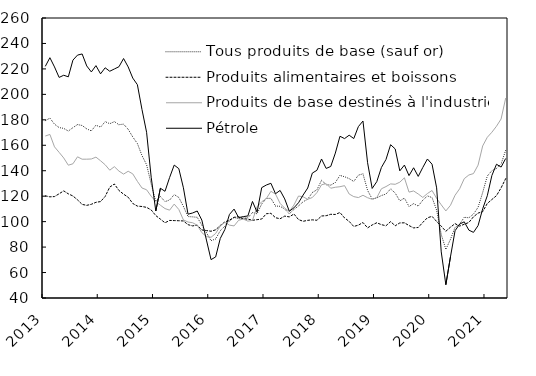
| Category | Tous produits de base (sauf or) | Produits alimentaires et boissons | Produits de base destinés à l'industrie | Pétrole |
|---|---|---|---|---|
| 2013 | 179.315 | 120.259 | 167.262 | 222.008 |
| 2013M2 | 181.359 | 119.479 | 168.512 | 228.805 |
| 2013M3 | 176.563 | 119.709 | 158.758 | 221.554 |
| 2013M4 | 173.905 | 121.885 | 154.441 | 213.313 |
| 2013M5 | 173.269 | 124.173 | 150.035 | 215.012 |
| 2013M6 | 171.169 | 121.837 | 144.348 | 213.779 |
| 2013M7 | 173.862 | 120.159 | 145.452 | 226.912 |
| 2013M8 | 176.258 | 117.119 | 150.925 | 230.852 |
| 2013M9 | 175.54 | 113.543 | 149.044 | 231.745 |
| 2013M10 | 172.863 | 112.804 | 149.074 | 222.316 |
| 2013M11 | 171.323 | 113.624 | 149.215 | 217.609 |
| 2013M12 | 175.774 | 115.189 | 150.677 | 222.568 |
| 2014 | 174.265 | 115.747 | 147.819 | 216.112 |
| 2014M2 | 178.546 | 119.764 | 144.708 | 220.88 |
| 2014M3 | 176.935 | 127.13 | 140.427 | 218.154 |
| 2014M4 | 178.571 | 129.574 | 143.177 | 219.945 |
| 2014M5 | 176.184 | 124.464 | 139.708 | 221.712 |
| 2014M6 | 176.61 | 121.591 | 137.345 | 228.155 |
| 2014M7 | 172.544 | 119.182 | 139.59 | 221.556 |
| 2014M8 | 166.509 | 114.278 | 137.52 | 212.788 |
| 2014M9 | 161.373 | 112.203 | 131.649 | 207.607 |
| 2014M10 | 151.914 | 111.897 | 126.427 | 188.066 |
| 2014M11 | 144.728 | 111.204 | 125.038 | 170.229 |
| 2014M12 | 129.62 | 109.182 | 119.964 | 134.86 |
| 2015 | 115.802 | 104.764 | 115.766 | 108.343 |
| 2015M2 | 119.77 | 101.967 | 112.895 | 126.228 |
| 2015M3 | 115.739 | 99.109 | 110.26 | 123.821 |
| 2015M4 | 116.979 | 100.93 | 109.024 | 134.673 |
| 2015M5 | 121.255 | 100.83 | 113.79 | 144.433 |
| 2015M6 | 118.975 | 100.704 | 109.543 | 141.632 |
| 2015M7 | 111.918 | 100.545 | 101.336 | 126.587 |
| 2015M8 | 103.991 | 97.611 | 99.683 | 105.847 |
| 2015M9 | 103.752 | 96.656 | 99.125 | 106.8 |
| 2015M10 | 103.387 | 97.253 | 97.182 | 108.349 |
| 2015M11 | 97.273 | 93.465 | 91.345 | 101.211 |
| 2015M12 | 91.34 | 92.995 | 88.243 | 85.533 |
| 2016 | 85.03 | 92.448 | 87.712 | 70.151 |
| 2016M2 | 86.381 | 93.565 | 90.702 | 72.264 |
| 2016M3 | 92.904 | 96.979 | 96.516 | 86.755 |
| 2016M4 | 96.447 | 99.745 | 99.375 | 93.788 |
| 2016M5 | 100.548 | 101.157 | 97.25 | 105.65 |
| 2016M6 | 103.318 | 103.398 | 96.635 | 109.862 |
| 2016M7 | 102.342 | 103.867 | 101.092 | 103.171 |
| 2016M8 | 102.839 | 102.184 | 102.013 | 103.943 |
| 2016M9 | 103.032 | 101.994 | 100.398 | 104.458 |
| 2016M10 | 107.148 | 101.066 | 101.007 | 115.851 |
| 2016M11 | 106.174 | 101.55 | 111.672 | 107.406 |
| 2016M12 | 113.838 | 102.048 | 115.628 | 126.701 |
| 2017 | 118.217 | 106.217 | 118.061 | 128.753 |
| 2017M2 | 118.348 | 106.52 | 123.831 | 130.134 |
| 2017M3 | 112.254 | 103.07 | 121.685 | 121.938 |
| 2017M4 | 112.061 | 102.277 | 114.313 | 124.52 |
| 2017M5 | 109.868 | 104.346 | 110.609 | 117.836 |
| 2017M6 | 106.175 | 103.717 | 107.98 | 108.209 |
| 2017M7 | 109.552 | 106.036 | 113.036 | 110.834 |
| 2017M8 | 112.351 | 101.615 | 120.119 | 114.853 |
| 2017M9 | 115.612 | 100.278 | 119.493 | 120.9 |
| 2017M10 | 117.624 | 101.026 | 117.539 | 126.426 |
| 2017M11 | 122.9 | 101.414 | 118.953 | 138.154 |
| 2017M12 | 125.015 | 101.076 | 122.815 | 140.336 |
| 2018 | 132.461 | 104.434 | 128.977 | 149.218 |
| 2018M2 | 129.103 | 104.658 | 129.864 | 141.805 |
| 2018M3 | 128.656 | 105.77 | 126.245 | 143.344 |
| 2018M4 | 130.792 | 105.636 | 127.009 | 153.865 |
| 2018M5 | 136.294 | 107.162 | 127.444 | 167.078 |
| 2018M6 | 135.283 | 102.908 | 128.27 | 165.24 |
| 2018M7 | 133.789 | 100.185 | 121.706 | 167.918 |
| 2018M8 | 131.569 | 96.184 | 119.661 | 165.282 |
| 2018M9 | 136.546 | 97.254 | 118.914 | 174.66 |
| 2018M10 | 137.506 | 99.308 | 120.706 | 179.056 |
| 2018M11 | 124.573 | 95.102 | 118.809 | 146.292 |
| 2018M12 | 117.772 | 97.404 | 117.535 | 126.077 |
| 2019 | 118.617 | 99.119 | 118.837 | 131.423 |
| 2019M2 | 120.512 | 97.622 | 125.809 | 142.528 |
| 2019M3 | 121.686 | 96.785 | 127.539 | 148.86 |
| 2019M4 | 125.721 | 100 | 129.657 | 160.454 |
| 2019M5 | 122.471 | 96.778 | 129.331 | 157.124 |
| 2019M6 | 116.283 | 98.98 | 130.989 | 139.917 |
| 2019M7 | 118.509 | 99.062 | 134.434 | 144.447 |
| 2019M8 | 111.881 | 96.929 | 123.198 | 136.171 |
| 2019M9 | 114.101 | 95.077 | 124.102 | 142.326 |
| 2019M10 | 112.247 | 95.417 | 121.736 | 135.546 |
| 2019M11 | 116.894 | 99.415 | 119.01 | 142.596 |
| 2019M12 | 120.191 | 103.042 | 122.086 | 149.215 |
| 2020 | 118.949 | 104.142 | 124.488 | 145.136 |
| 2020M2 | 109.017 | 100.118 | 118.313 | 126.529 |
| 2020M3 | 89.907 | 96.443 | 113.213 | 76.22 |
| 2020M4 | 78.219 | 92.418 | 108.407 | 50.446 |
| 2020M5 | 86.112 | 95.631 | 112.803 | 72.252 |
| 2020M6 | 95.476 | 98.422 | 120.717 | 92.833 |
| 2020M7 | 98.037 | 96.493 | 125.86 | 98.081 |
| 2020M8 | 103.415 | 97.942 | 133.782 | 99.853 |
| 2020M9 | 103.03 | 99.35 | 136.652 | 93.324 |
| 2020M10 | 105.908 | 103.791 | 137.756 | 91.569 |
| 2020M11 | 111.251 | 106.702 | 144.381 | 96.878 |
| 2020M12 | 122.884 | 107.822 | 159.486 | 110.071 |
| 2021 | 135.798 | 114.263 | 166.257 | 120.32 |
| 2021M2 | 140.079 | 117.381 | 170.255 | 136.26 |
| 2021M3 | 141.798 | 120.435 | 174.963 | 145.101 |
| 2021M4 | 145.283 | 126.53 | 180.668 | 142.873 |
| 2021M5 | 156.127 | 133.822 | 197.108 | 149.636 |